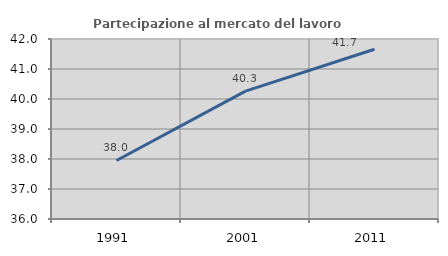
| Category | Partecipazione al mercato del lavoro  femminile |
|---|---|
| 1991.0 | 37.952 |
| 2001.0 | 40.26 |
| 2011.0 | 41.658 |